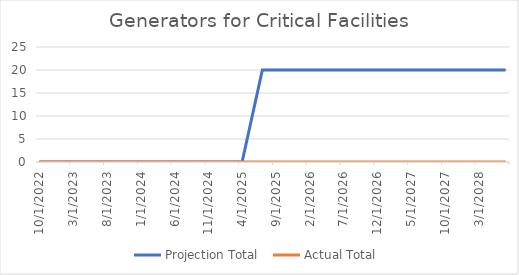
| Category | Projection Total  | Actual Total  |
|---|---|---|
| 10/1/22 | 0 | 0 |
| 1/1/23 | 0 | 0 |
| 4/1/23 | 0 | 0 |
| 7/1/23 | 0 | 0 |
| 10/1/23 | 0 | 0 |
| 1/1/24 | 0 | 0 |
| 4/1/24 | 0 | 0 |
| 7/1/24 | 0 | 0 |
| 10/1/24 | 0 | 0 |
| 1/1/25 | 0 | 0 |
| 4/1/25 | 0 | 0 |
| 7/1/25 | 20 | 0 |
| 10/1/25 | 20 | 0 |
| 1/1/26 | 20 | 0 |
| 4/1/26 | 20 | 0 |
| 7/1/26 | 20 | 0 |
| 10/1/26 | 20 | 0 |
| 1/1/27 | 20 | 0 |
| 4/1/27 | 20 | 0 |
| 7/1/27 | 20 | 0 |
| 10/1/27 | 20 | 0 |
| 1/1/28 | 20 | 0 |
| 4/1/28 | 20 | 0 |
| 7/1/28 | 20 | 0 |